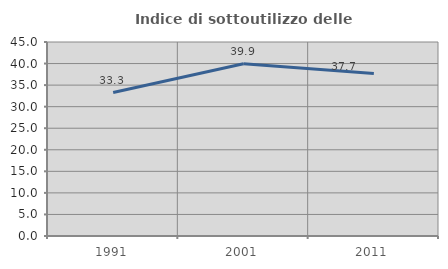
| Category | Indice di sottoutilizzo delle abitazioni  |
|---|---|
| 1991.0 | 33.271 |
| 2001.0 | 39.939 |
| 2011.0 | 37.667 |